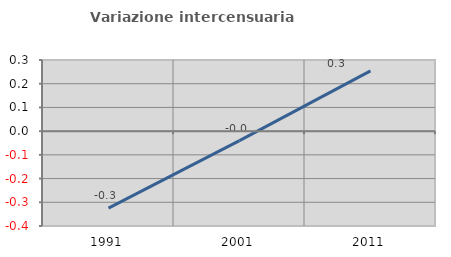
| Category | Variazione intercensuaria annua |
|---|---|
| 1991.0 | -0.324 |
| 2001.0 | -0.04 |
| 2011.0 | 0.254 |